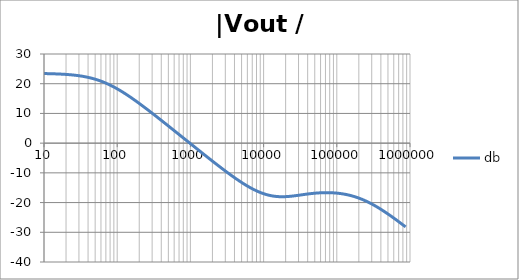
| Category | db |
|---|---|
| 1.0 | 23.516 |
| 1.0715193052376064 | 23.516 |
| 1.1481536214968828 | 23.515 |
| 1.2302687708123814 | 23.515 |
| 1.318256738556407 | 23.515 |
| 1.4125375446227544 | 23.515 |
| 1.513561248436208 | 23.514 |
| 1.6218100973589298 | 23.514 |
| 1.7378008287493754 | 23.514 |
| 1.8620871366628673 | 23.513 |
| 1.9952623149688797 | 23.513 |
| 2.1379620895022318 | 23.512 |
| 2.2908676527677727 | 23.511 |
| 2.45470891568503 | 23.511 |
| 2.6302679918953817 | 23.51 |
| 2.8183829312644537 | 23.509 |
| 3.0199517204020156 | 23.507 |
| 3.235936569296282 | 23.506 |
| 3.467368504525316 | 23.505 |
| 3.7153522909717256 | 23.503 |
| 3.9810717055349727 | 23.501 |
| 4.265795188015926 | 23.498 |
| 4.570881896148749 | 23.496 |
| 4.897788193684462 | 23.492 |
| 5.2480746024977245 | 23.489 |
| 5.62341325190349 | 23.485 |
| 6.025595860743575 | 23.48 |
| 6.456542290346554 | 23.475 |
| 6.918309709189363 | 23.468 |
| 7.4131024130091765 | 23.461 |
| 7.943282347242814 | 23.453 |
| 8.511380382023765 | 23.444 |
| 9.120108393559095 | 23.433 |
| 9.772372209558105 | 23.421 |
| 10.47128548050899 | 23.407 |
| 11.22018454301963 | 23.391 |
| 12.022644346174127 | 23.372 |
| 12.88249551693134 | 23.351 |
| 13.803842646028851 | 23.327 |
| 14.791083881682074 | 23.3 |
| 15.848931924611136 | 23.269 |
| 16.98243652461744 | 23.233 |
| 18.197008586099834 | 23.192 |
| 19.498445997580447 | 23.146 |
| 20.892961308540382 | 23.094 |
| 22.387211385683386 | 23.035 |
| 23.988329190194897 | 22.968 |
| 25.703957827688622 | 22.892 |
| 27.54228703338165 | 22.807 |
| 29.51209226666385 | 22.711 |
| 31.62277660168379 | 22.603 |
| 33.884415613920254 | 22.483 |
| 36.307805477010106 | 22.348 |
| 38.90451449942804 | 22.199 |
| 41.686938347033525 | 22.034 |
| 44.6683592150963 | 21.852 |
| 47.86300923226381 | 21.652 |
| 51.28613839913647 | 21.433 |
| 54.95408738576247 | 21.194 |
| 58.88436553555889 | 20.935 |
| 63.09573444801931 | 20.656 |
| 67.60829753919813 | 20.357 |
| 72.44359600749901 | 20.036 |
| 77.62471166286915 | 19.695 |
| 83.17637711026705 | 19.334 |
| 89.12509381337456 | 18.953 |
| 95.49925860214357 | 18.554 |
| 102.32929922807544 | 18.136 |
| 109.64781961431841 | 17.702 |
| 117.48975549395293 | 17.252 |
| 125.89254117941665 | 16.786 |
| 134.89628825916537 | 16.307 |
| 144.54397707459273 | 15.815 |
| 154.88166189124806 | 15.311 |
| 165.95869074375608 | 14.797 |
| 177.82794100389225 | 14.273 |
| 190.5460717963248 | 13.74 |
| 204.17379446695278 | 13.2 |
| 218.77616239495524 | 12.652 |
| 234.42288153199212 | 12.099 |
| 251.18864315095806 | 11.54 |
| 269.15348039269156 | 10.976 |
| 288.4031503126605 | 10.407 |
| 309.0295432513591 | 9.835 |
| 331.1311214825911 | 9.26 |
| 354.81338923357566 | 8.682 |
| 380.18939632056095 | 8.101 |
| 407.3802778041123 | 7.518 |
| 436.5158322401654 | 6.933 |
| 467.7351412871979 | 6.346 |
| 501.18723362727184 | 5.758 |
| 537.0317963702526 | 5.169 |
| 575.4399373371566 | 4.579 |
| 616.5950018614822 | 3.988 |
| 660.6934480075952 | 3.397 |
| 707.9457843841375 | 2.805 |
| 758.5775750291831 | 2.213 |
| 812.8305161640983 | 1.62 |
| 870.9635899560801 | 1.028 |
| 933.2543007969903 | 0.435 |
| 999.9999999999998 | -0.157 |
| 1071.5193052376057 | -0.749 |
| 1148.1536214968828 | -1.34 |
| 1230.2687708123801 | -1.93 |
| 1318.2567385564053 | -2.52 |
| 1412.537544622753 | -3.108 |
| 1513.5612484362066 | -3.695 |
| 1621.8100973589292 | -4.281 |
| 1737.8008287493742 | -4.864 |
| 1862.0871366628671 | -5.446 |
| 1995.2623149688786 | -6.025 |
| 2137.9620895022326 | -6.601 |
| 2290.867652767771 | -7.175 |
| 2454.708915685027 | -7.744 |
| 2630.26799189538 | -8.309 |
| 2818.382931264451 | -8.869 |
| 3019.9517204020176 | -9.424 |
| 3235.9365692962774 | -9.972 |
| 3467.368504525316 | -10.514 |
| 3715.352290971724 | -11.047 |
| 3981.07170553497 | -11.571 |
| 4265.795188015923 | -12.085 |
| 4570.881896148745 | -12.588 |
| 4897.788193684463 | -13.078 |
| 5248.074602497726 | -13.553 |
| 5623.413251903489 | -14.013 |
| 6025.595860743574 | -14.456 |
| 6456.54229034655 | -14.88 |
| 6918.309709189357 | -15.283 |
| 7413.102413009165 | -15.663 |
| 7943.282347242815 | -16.02 |
| 8511.380382023763 | -16.351 |
| 9120.108393559092 | -16.654 |
| 9772.3722095581 | -16.929 |
| 10471.285480509003 | -17.174 |
| 11220.184543019639 | -17.388 |
| 12022.64434617411 | -17.571 |
| 12882.495516931338 | -17.722 |
| 13803.842646028841 | -17.843 |
| 14791.083881682063 | -17.932 |
| 15848.931924611119 | -17.993 |
| 16982.436524617453 | -18.025 |
| 18197.008586099837 | -18.032 |
| 19498.445997580417 | -18.015 |
| 20892.961308540387 | -17.977 |
| 22387.211385683382 | -17.92 |
| 23988.32919019488 | -17.848 |
| 25703.957827688606 | -17.763 |
| 27542.28703338167 | -17.669 |
| 29512.092266663854 | -17.568 |
| 31622.77660168378 | -17.464 |
| 33884.41561392023 | -17.359 |
| 36307.805477010166 | -17.256 |
| 38904.514499428085 | -17.156 |
| 41686.93834703348 | -17.061 |
| 44668.35921509631 | -16.974 |
| 47863.00923226382 | -16.895 |
| 51286.13839913646 | -16.827 |
| 54954.08738576241 | -16.769 |
| 58884.365535558936 | -16.722 |
| 63095.73444801934 | -16.688 |
| 67608.29753919817 | -16.667 |
| 72443.59600749899 | -16.66 |
| 77624.71166286913 | -16.666 |
| 83176.37711026703 | -16.688 |
| 89125.09381337445 | -16.724 |
| 95499.25860214363 | -16.776 |
| 102329.29922807543 | -16.845 |
| 109647.81961431848 | -16.93 |
| 117489.75549395289 | -17.034 |
| 125892.54117941685 | -17.156 |
| 134896.28825916522 | -17.297 |
| 144543.97707459255 | -17.457 |
| 154881.66189124787 | -17.639 |
| 165958.69074375575 | -17.841 |
| 177827.9410038922 | -18.065 |
| 190546.07179632425 | -18.311 |
| 204173.79446695274 | -18.579 |
| 218776.16239495497 | -18.869 |
| 234422.88153199226 | -19.181 |
| 251188.64315095753 | -19.515 |
| 269153.480392691 | -19.869 |
| 288403.15031266044 | -20.244 |
| 309029.5432513582 | -20.639 |
| 331131.1214825907 | -21.052 |
| 354813.3892335749 | -21.483 |
| 380189.3963205612 | -21.93 |
| 407380.2778041119 | -22.392 |
| 436515.8322401649 | -22.869 |
| 467735.14128719777 | -23.359 |
| 501187.2336272717 | -23.861 |
| 537031.7963702519 | -24.374 |
| 575439.9373371559 | -24.896 |
| 616595.001861482 | -25.428 |
| 660693.4480075944 | -25.967 |
| 707945.7843841374 | -26.514 |
| 758577.575029183 | -27.067 |
| 812830.5161640996 | -27.626 |
| 870963.5899560791 | -28.189 |